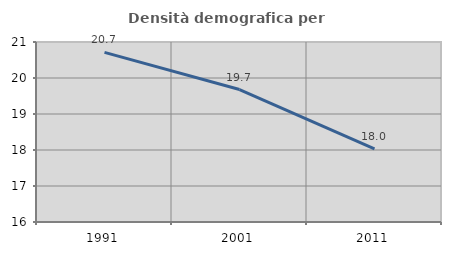
| Category | Densità demografica |
|---|---|
| 1991.0 | 20.711 |
| 2001.0 | 19.68 |
| 2011.0 | 18.029 |